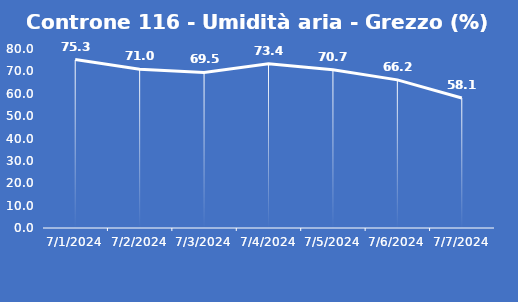
| Category | Controne 116 - Umidità aria - Grezzo (%) |
|---|---|
| 7/1/24 | 75.3 |
| 7/2/24 | 71 |
| 7/3/24 | 69.5 |
| 7/4/24 | 73.4 |
| 7/5/24 | 70.7 |
| 7/6/24 | 66.2 |
| 7/7/24 | 58.1 |